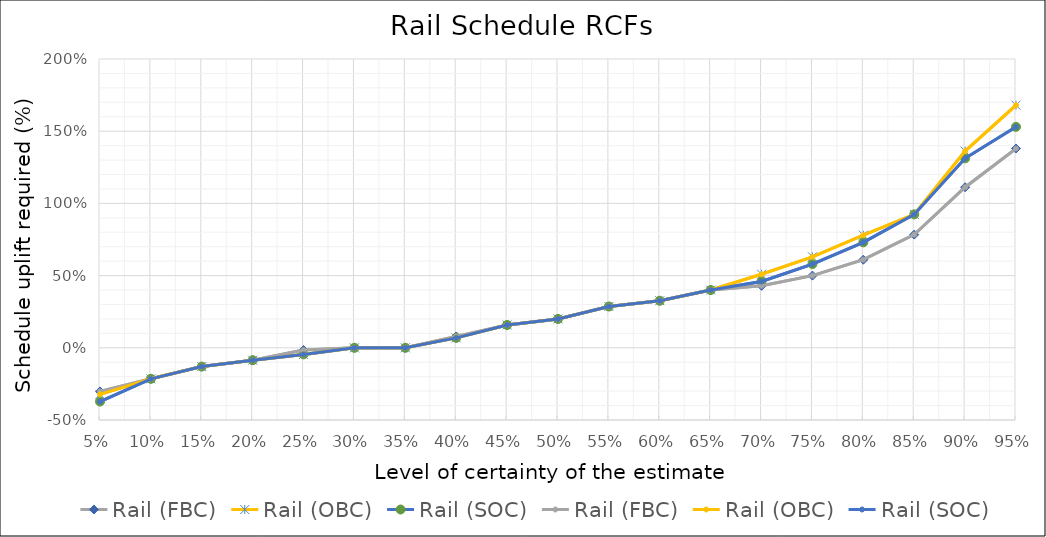
| Category | Rail (FBC) | Rail (OBC) | Rail (SOC) |
|---|---|---|---|
| 0.05 | -0.302 | -0.322 | -0.372 |
| 0.1 | -0.215 | -0.215 | -0.215 |
| 0.15 | -0.13 | -0.13 | -0.13 |
| 0.2 | -0.086 | -0.086 | -0.086 |
| 0.25 | -0.016 | -0.046 | -0.046 |
| 0.3 | 0 | 0 | 0 |
| 0.35 | 0 | 0 | 0 |
| 0.4 | 0.079 | 0.069 | 0.069 |
| 0.45 | 0.158 | 0.158 | 0.158 |
| 0.5 | 0.2 | 0.2 | 0.2 |
| 0.55 | 0.286 | 0.286 | 0.286 |
| 0.6 | 0.326 | 0.326 | 0.326 |
| 0.65 | 0.4 | 0.4 | 0.4 |
| 0.7 | 0.429 | 0.509 | 0.459 |
| 0.75 | 0.5 | 0.63 | 0.58 |
| 0.8 | 0.61 | 0.78 | 0.73 |
| 0.85 | 0.784 | 0.924 | 0.924 |
| 0.9 | 1.112 | 1.362 | 1.312 |
| 0.95 | 1.38 | 1.68 | 1.53 |